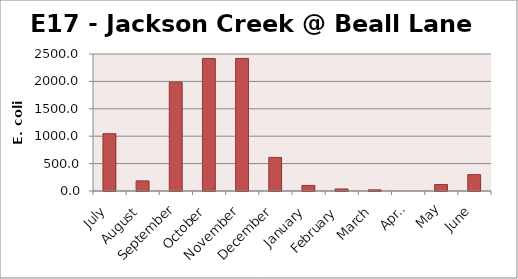
| Category | E. coli MPN |
|---|---|
| July | 1046.2 |
| August | 185 |
| September | 1986.3 |
| October | 2419.2 |
| November | 2419.2 |
| December | 613.1 |
| January | 101.7 |
| February | 37.3 |
| March | 21.1 |
| April | 0 |
| May | 117.8 |
| June | 298.7 |